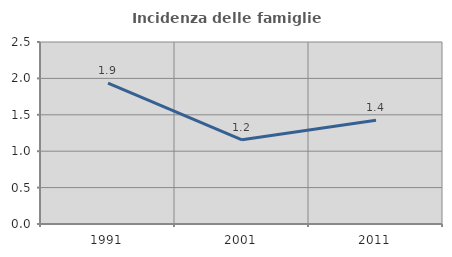
| Category | Incidenza delle famiglie numerose |
|---|---|
| 1991.0 | 1.935 |
| 2001.0 | 1.157 |
| 2011.0 | 1.425 |